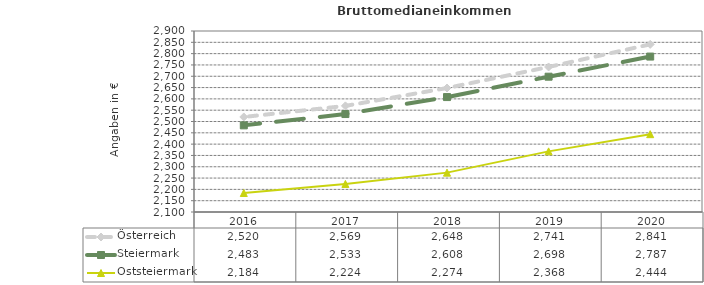
| Category | Österreich | Steiermark | Oststeiermark |
|---|---|---|---|
| 2020.0 | 2841 | 2787 | 2444 |
| 2019.0 | 2741 | 2698 | 2368 |
| 2018.0 | 2648 | 2608 | 2274 |
| 2017.0 | 2569 | 2533 | 2224 |
| 2016.0 | 2520 | 2483 | 2184 |